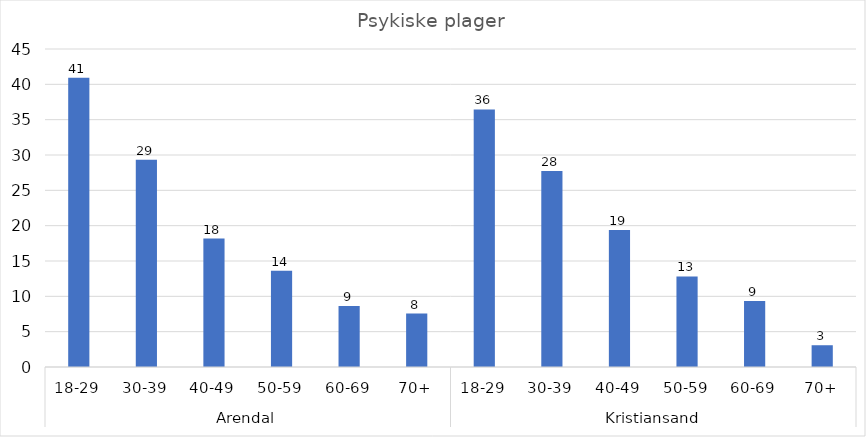
| Category | Psykiske plager |
|---|---|
| 0 | 40.945 |
| 1 | 29.344 |
| 2 | 18.182 |
| 3 | 13.613 |
| 4 | 8.635 |
| 5 | 7.566 |
| 6 | 36.439 |
| 7 | 27.721 |
| 8 | 19.384 |
| 9 | 12.821 |
| 10 | 9.349 |
| 11 | 3.08 |